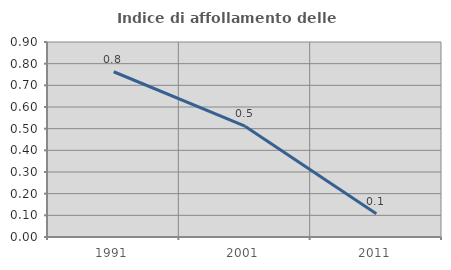
| Category | Indice di affollamento delle abitazioni  |
|---|---|
| 1991.0 | 0.763 |
| 2001.0 | 0.512 |
| 2011.0 | 0.107 |